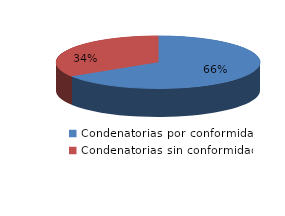
| Category | Series 0 |
|---|---|
| 0 | 31 |
| 1 | 16 |